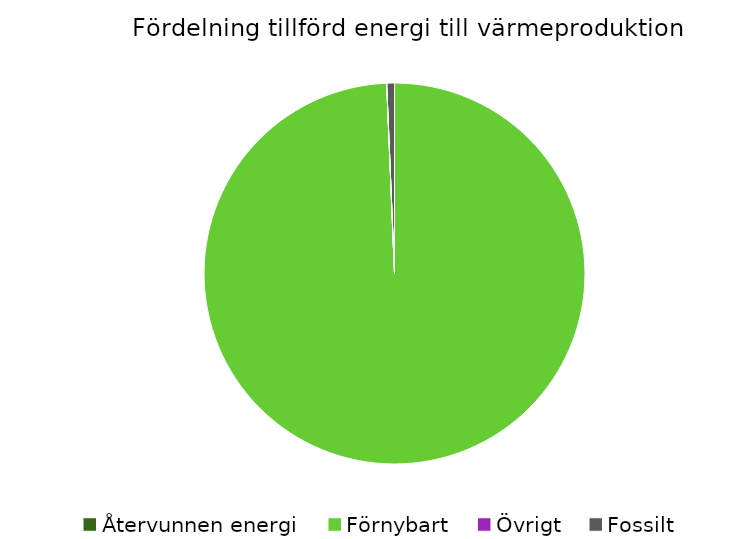
| Category | Fördelning värmeproduktion |
|---|---|
| Återvunnen energi | 0 |
| Förnybart | 0.993 |
| Övrigt | 0 |
| Fossilt | 0.007 |